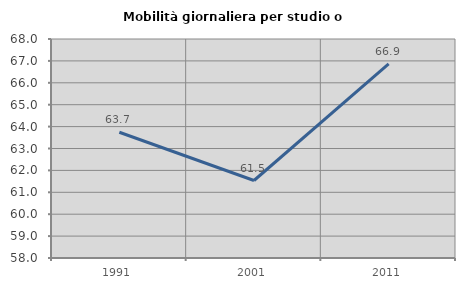
| Category | Mobilità giornaliera per studio o lavoro |
|---|---|
| 1991.0 | 63.742 |
| 2001.0 | 61.538 |
| 2011.0 | 66.865 |